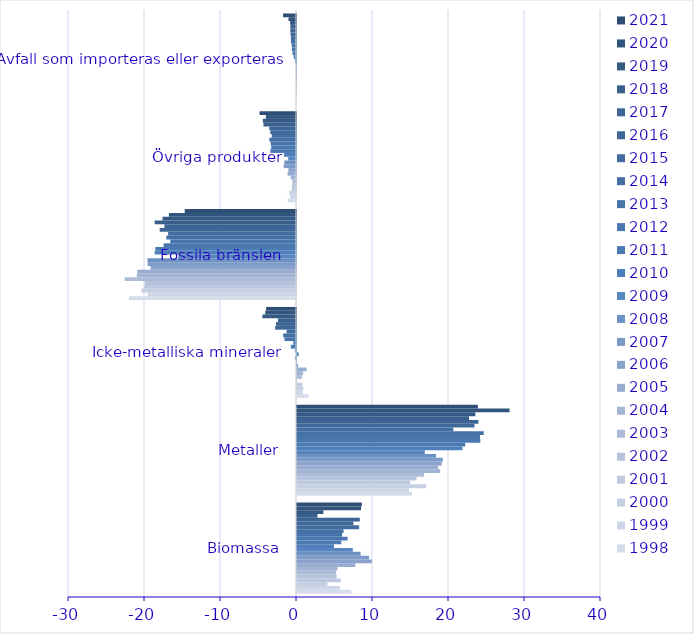
| Category | 1998 | 1999 | 2000 | 2001 | 2002 | 2003 | 2004 | 2005 | 2006 | 2007 | 2008 | 2009 | 2010 | 2011 | 2012 | 2013 | 2014 | 2015 | 2016 | 2017 | 2018 | 2019 | 2020 | 2021 |
|---|---|---|---|---|---|---|---|---|---|---|---|---|---|---|---|---|---|---|---|---|---|---|---|---|
| Biomassa | 7.155 | 5.646 | 4.006 | 5.745 | 5.214 | 5.129 | 5.324 | 7.68 | 9.854 | 9.479 | 8.37 | 7.344 | 4.868 | 5.828 | 6.657 | 5.93 | 6.124 | 8.178 | 7.418 | 8.266 | 2.696 | 3.474 | 8.429 | 8.53 |
| Metaller | 15.11 | 14.74 | 16.983 | 14.88 | 15.735 | 16.716 | 18.835 | 18.572 | 19.062 | 19.19 | 18.291 | 16.819 | 21.769 | 22.139 | 24.122 | 24.076 | 24.563 | 20.564 | 23.355 | 23.862 | 22.633 | 23.466 | 27.969 | 23.8 |
| Icke-metalliska mineraler | 1.521 | 0.726 | 0.835 | 0.719 | -0.034 | 0.636 | 0.795 | 1.249 | 0.15 | 0.005 | -0.148 | 0.223 | -0.152 | -0.679 | -0.36 | -1.529 | -1.692 | -1.239 | -2.738 | -2.63 | -2.375 | -4.426 | -4.05 | -3.932 |
| Fossila bränslen | -21.988 | -19.506 | -20.354 | -19.978 | -19.893 | -22.552 | -20.945 | -20.876 | -19.131 | -19.5 | -19.543 | -15.474 | -18.591 | -18.518 | -17.422 | -16.543 | -17.077 | -16.83 | -17.935 | -17.319 | -18.599 | -17.559 | -16.719 | -14.642 |
| Övriga produkter | -1.083 | -0.784 | -0.882 | -0.553 | -0.531 | -0.472 | -0.702 | -1.108 | -1.006 | -1.629 | -1.537 | -1.024 | -1.573 | -3.384 | -3.263 | -3.334 | -3.507 | -3.187 | -3.379 | -3.511 | -4.279 | -4.357 | -3.956 | -4.795 |
| Avfall som importeras eller exporteras | 0 | 0 | 0 | 0 | -0.002 | -0.002 | -0.002 | -0.017 | -0.008 | -0.013 | -0.027 | -0.156 | -0.29 | -0.46 | -0.534 | -0.56 | -0.667 | -0.671 | -0.712 | -0.756 | -0.736 | -0.773 | -0.991 | -1.706 |